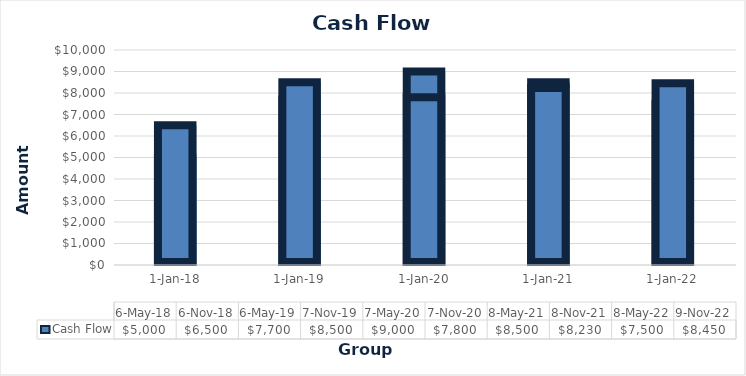
| Category | Cash Flow |
|---|---|
| 2018-05-06 | 5000 |
| 2018-11-06 | 6500 |
| 2019-05-06 | 7700 |
| 2019-11-07 | 8500 |
| 2020-05-07 | 9000 |
| 2020-11-07 | 7800 |
| 2021-05-08 | 8500 |
| 2021-11-08 | 8230 |
| 2022-05-08 | 7500 |
| 2022-11-09 | 8450 |